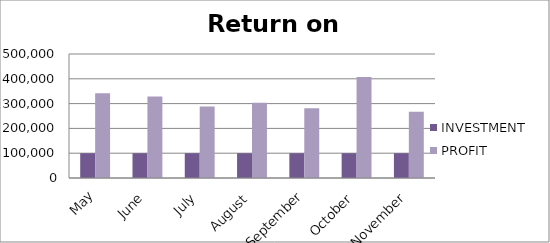
| Category | INVESTMENT  | PROFIT |
|---|---|---|
| May | 100000 | 341995 |
| June | 100000 | 328918 |
| July | 100000 | 288028 |
| August | 100000 | 303853 |
| September | 100000 | 281093 |
| October | 100000 | 407723 |
| November | 100000 | 267572 |